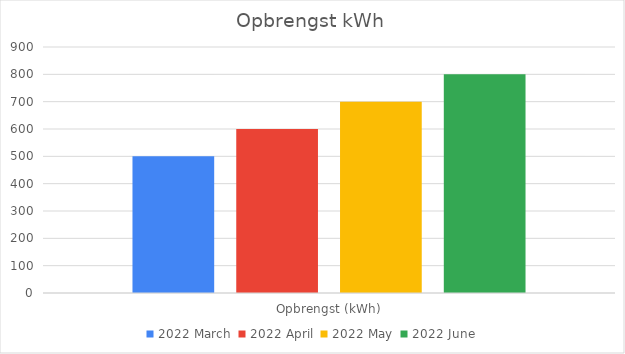
| Category | 2022 maart | 2022 april | 2022 mei | 2022 juni |
|---|---|---|---|---|
| Opbrengst (kWh) | 500 | 600 | 700 | 800 |